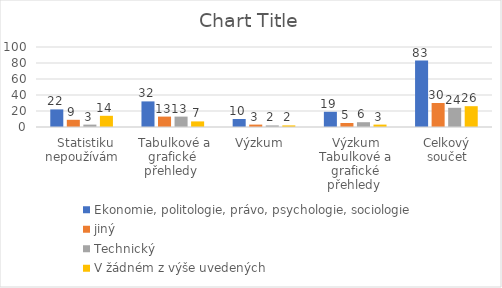
| Category | Ekonomie, politologie, právo, psychologie, sociologie | jiný | Technický | V žádném z výše uvedených |
|---|---|---|---|---|
|   Statistiku nepoužívám | 22 | 9 | 3 | 14 |
|  Tabulkové a grafické přehledy  | 32 | 13 | 13 | 7 |
| Výzkum   | 10 | 3 | 2 | 2 |
| Výzkum Tabulkové a grafické přehledy  | 19 | 5 | 6 | 3 |
| Celkový součet | 83 | 30 | 24 | 26 |